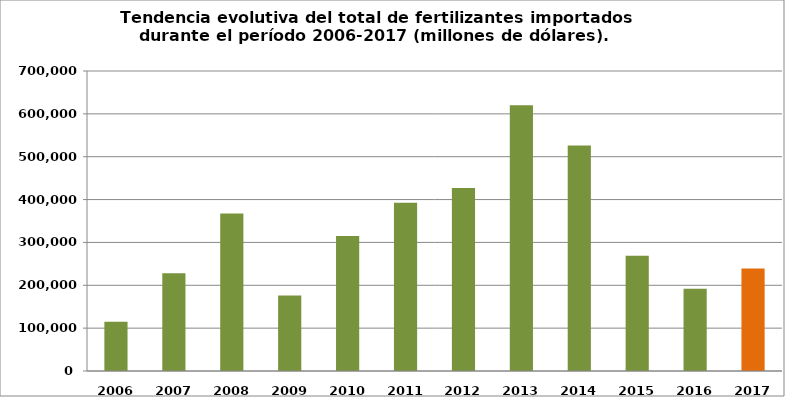
| Category | TOTAL (U$S) |
|---|---|
| 2006.0 | 114655.657 |
| 2007.0 | 228272 |
| 2008.0 | 367624.408 |
| 2009.0 | 175972.375 |
| 2010.0 | 314744 |
| 2011.0 | 392558 |
| 2012.0 | 426946 |
| 2013.0 | 620342 |
| 2014.0 | 525900 |
| 2015.0 | 268889.397 |
| 2016.0 | 191773 |
| 2017.0 | 239360.409 |